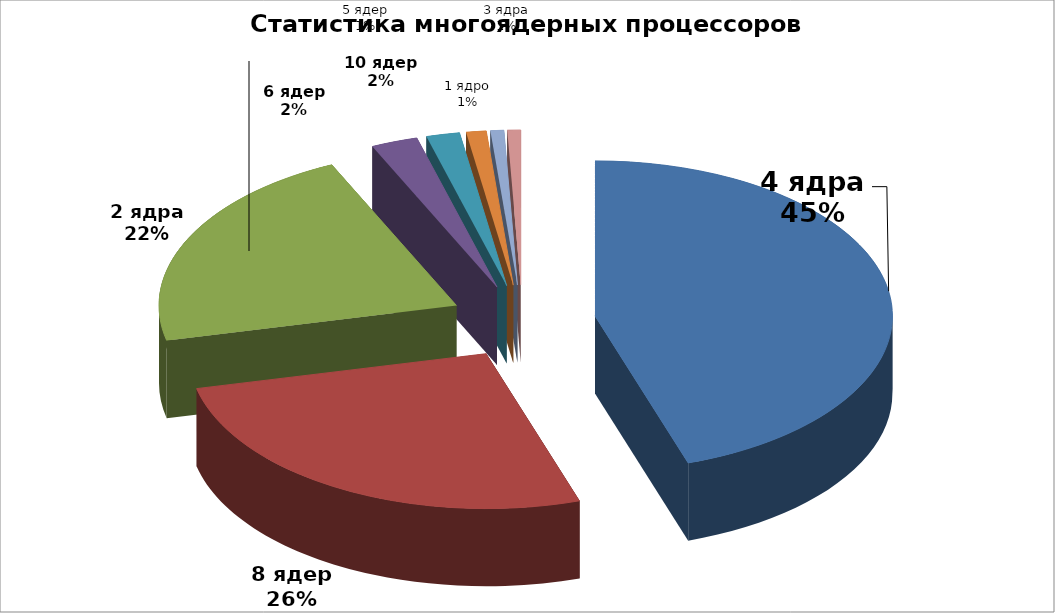
| Category | Series 0 |
|---|---|
| 4 ядра | 124 |
| 8 ядер | 73 |
| 2 ядра | 60 |
| 6 ядер | 7 |
| 10 ядер | 5 |
| 1 ядро | 3 |
| 3 ядра | 2 |
| 5 ядер | 2 |